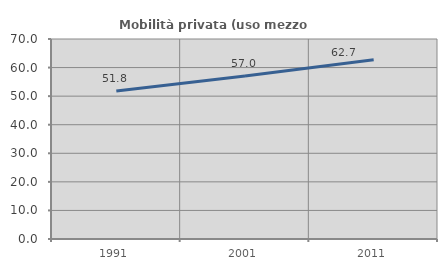
| Category | Mobilità privata (uso mezzo privato) |
|---|---|
| 1991.0 | 51.784 |
| 2001.0 | 57.031 |
| 2011.0 | 62.743 |